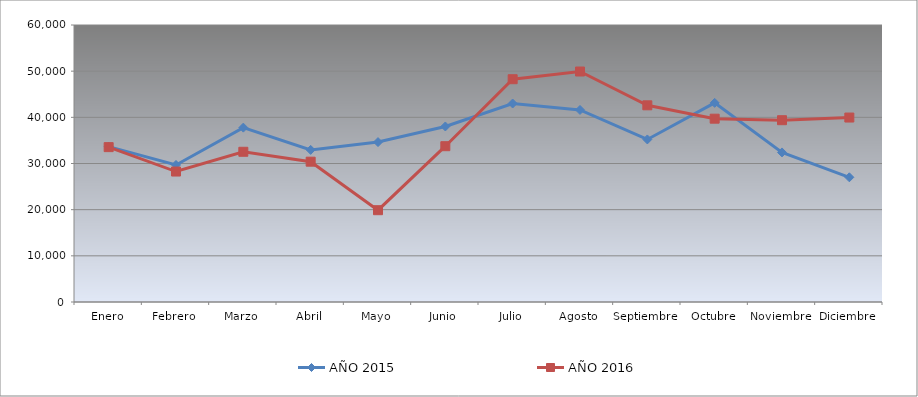
| Category | AÑO 2015 | AÑO 2016 |
|---|---|---|
| Enero | 33646.111 | 33545.848 |
| Febrero | 29682.552 | 28259.512 |
| Marzo | 37767.655 | 32539.28 |
| Abril | 32946.022 | 30392.725 |
| Mayo | 34638.937 | 19886.763 |
| Junio | 38018.572 | 33748.941 |
| Julio | 42993.544 | 48258.94 |
| Agosto | 41599.56 | 49926.67 |
| Septiembre | 35210.47 | 42601.997 |
| Octubre | 43137.588 | 39706.816 |
| Noviembre | 32397.721 | 39380.682 |
| Diciembre | 27009.201 | 39955.864 |